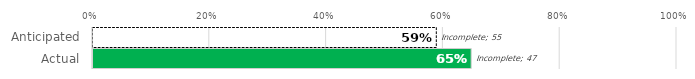
| Category | Complete | Incomplete |
|---|---|---|
| Anticipated | 79 | 55 |
| Actual | 87 | 47 |